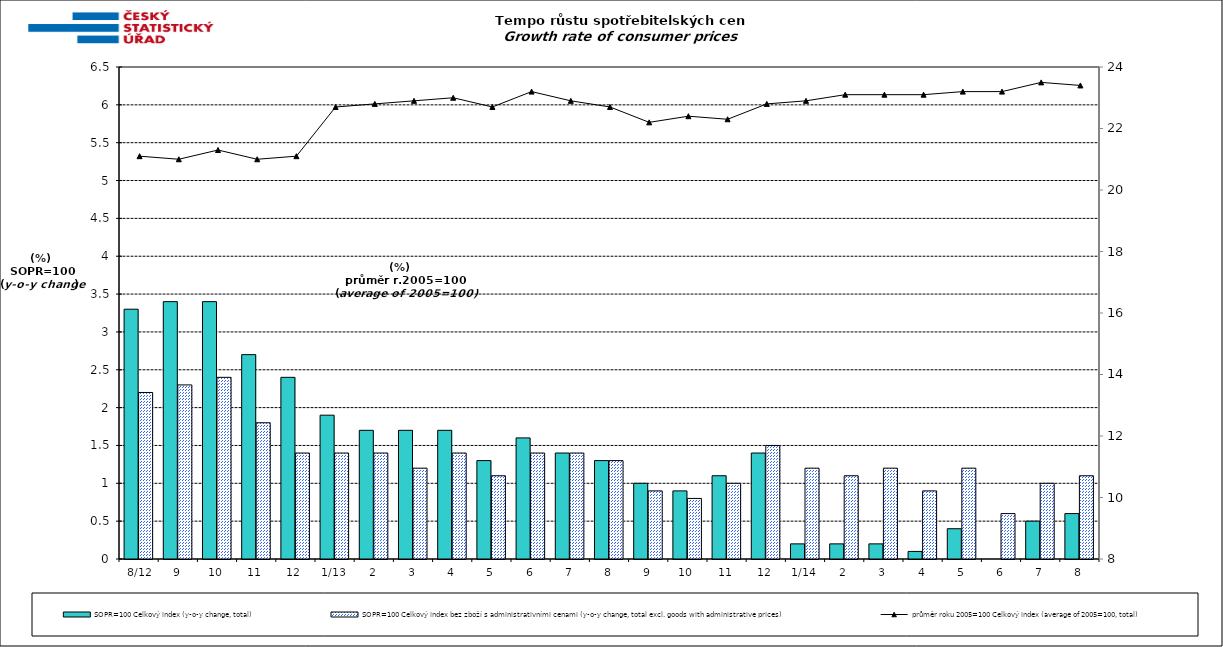
| Category | SOPR=100 Celkový index (y-o-y change, total) | SOPR=100 Celkový index bez zboží s administrativními cenami (y-o-y change, total excl. goods with administrative prices)  |
|---|---|---|
|  8/12 | 3.3 | 2.2 |
| 9 | 3.4 | 2.3 |
| 10 | 3.4 | 2.4 |
| 11 | 2.7 | 1.8 |
| 12 | 2.4 | 1.4 |
| 1/13 | 1.9 | 1.4 |
| 2 | 1.7 | 1.4 |
| 3 | 1.7 | 1.2 |
| 4 | 1.7 | 1.4 |
| 5 | 1.3 | 1.1 |
| 6 | 1.6 | 1.4 |
| 7 | 1.4 | 1.4 |
| 8 | 1.3 | 1.3 |
| 9 | 1 | 0.9 |
| 10 | 0.9 | 0.8 |
| 11 | 1.1 | 1 |
| 12 | 1.4 | 1.5 |
| 1/14 | 0.2 | 1.2 |
| 2 | 0.2 | 1.1 |
| 3 | 0.2 | 1.2 |
| 4 | 0.1 | 0.9 |
| 5 | 0.4 | 1.2 |
| 6 | 0 | 0.6 |
| 7 | 0.5 | 1 |
| 8 | 0.6 | 1.1 |